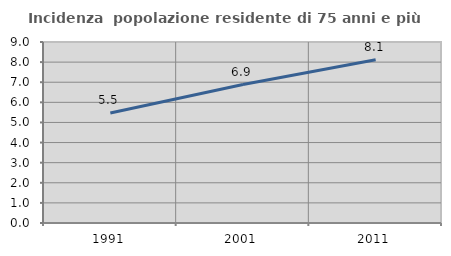
| Category | Incidenza  popolazione residente di 75 anni e più |
|---|---|
| 1991.0 | 5.468 |
| 2001.0 | 6.883 |
| 2011.0 | 8.116 |